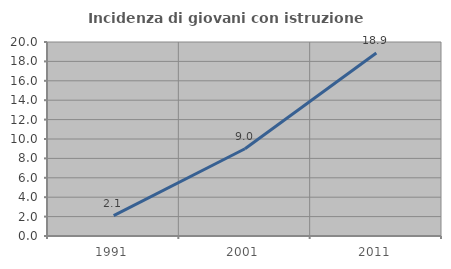
| Category | Incidenza di giovani con istruzione universitaria |
|---|---|
| 1991.0 | 2.105 |
| 2001.0 | 8.993 |
| 2011.0 | 18.857 |